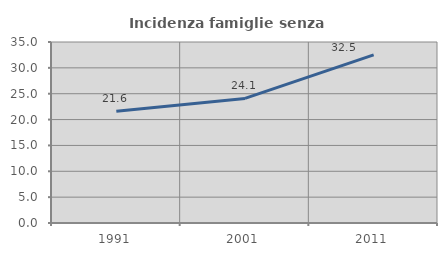
| Category | Incidenza famiglie senza nuclei |
|---|---|
| 1991.0 | 21.629 |
| 2001.0 | 24.088 |
| 2011.0 | 32.499 |